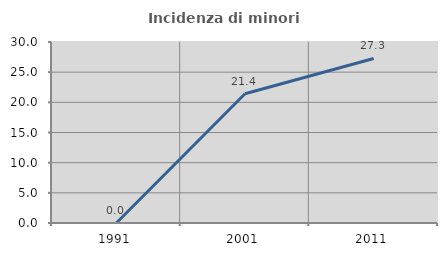
| Category | Incidenza di minori stranieri |
|---|---|
| 1991.0 | 0 |
| 2001.0 | 21.429 |
| 2011.0 | 27.273 |